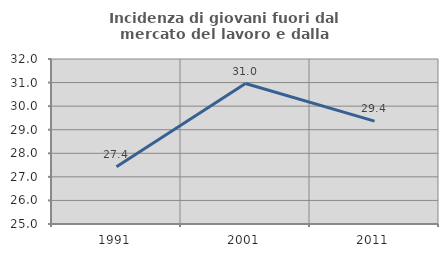
| Category | Incidenza di giovani fuori dal mercato del lavoro e dalla formazione  |
|---|---|
| 1991.0 | 27.427 |
| 2001.0 | 30.959 |
| 2011.0 | 29.364 |